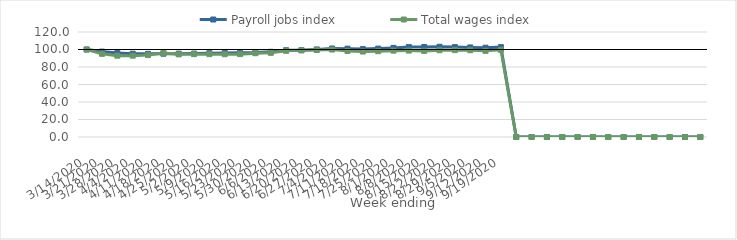
| Category | Payroll jobs index | Total wages index |
|---|---|---|
| 14/03/2020 | 100 | 100 |
| 21/03/2020 | 97.604 | 95.037 |
| 28/03/2020 | 96.126 | 92.908 |
| 04/04/2020 | 95.223 | 92.948 |
| 11/04/2020 | 95.026 | 93.582 |
| 18/04/2020 | 95.211 | 95.956 |
| 25/04/2020 | 95.285 | 94.479 |
| 02/05/2020 | 95.381 | 94.709 |
| 09/05/2020 | 95.803 | 94.704 |
| 16/05/2020 | 96.084 | 94.591 |
| 23/05/2020 | 96.249 | 94.706 |
| 30/05/2020 | 96.497 | 95.775 |
| 06/06/2020 | 97.36 | 96.188 |
| 13/06/2020 | 99.166 | 98.536 |
| 20/06/2020 | 99.249 | 99.075 |
| 27/06/2020 | 100.085 | 99.451 |
| 04/07/2020 | 101.176 | 99.948 |
| 11/07/2020 | 100.945 | 98.338 |
| 18/07/2020 | 100.43 | 97.648 |
| 25/07/2020 | 101.008 | 98.077 |
| 01/08/2020 | 101.854 | 98.706 |
| 08/08/2020 | 102.738 | 98.737 |
| 15/08/2020 | 102.879 | 98.412 |
| 22/08/2020 | 103.096 | 99.159 |
| 29/08/2020 | 102.728 | 99.278 |
| 05/09/2020 | 102.371 | 99.146 |
| 12/09/2020 | 102.037 | 98.459 |
| 19/09/2020 | 102.682 | 99.63 |